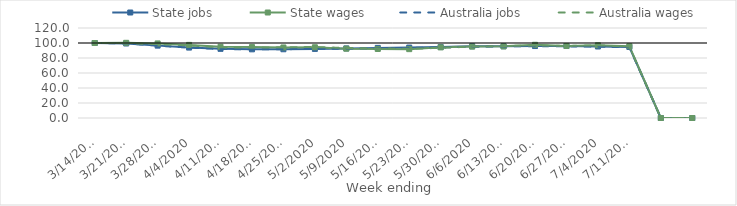
| Category | State jobs | State wages | Australia jobs | Australia wages |
|---|---|---|---|---|
| 14/03/2020 | 100 | 100 | 100 | 100 |
| 21/03/2020 | 99.329 | 100.251 | 99.345 | 99.743 |
| 28/03/2020 | 96.499 | 99.433 | 96.491 | 98.481 |
| 04/04/2020 | 93.882 | 97.479 | 93.819 | 96.778 |
| 11/04/2020 | 92.215 | 94.975 | 91.996 | 94.184 |
| 18/04/2020 | 91.556 | 94.548 | 91.451 | 94.032 |
| 25/04/2020 | 91.663 | 94.042 | 91.738 | 94.241 |
| 02/05/2020 | 92.118 | 94.328 | 92.109 | 94.689 |
| 09/05/2020 | 92.772 | 92.417 | 92.629 | 93.316 |
| 16/05/2020 | 93.483 | 91.982 | 93.158 | 92.67 |
| 23/05/2020 | 93.898 | 91.801 | 93.449 | 92.26 |
| 30/05/2020 | 94.569 | 94.198 | 94.006 | 93.552 |
| 06/06/2020 | 95.63 | 95.218 | 94.942 | 95.15 |
| 13/06/2020 | 95.643 | 95.502 | 95.443 | 95.811 |
| 20/06/2020 | 95.954 | 97.626 | 95.785 | 96.851 |
| 27/06/2020 | 95.985 | 96.068 | 95.571 | 95.974 |
| 04/07/2020 | 95.316 | 97.031 | 95.033 | 96.971 |
| 11/07/2020 | 94.695 | 95.727 | 94.423 | 95.167 |